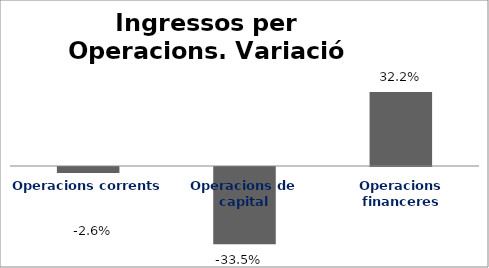
| Category | Series 0 |
|---|---|
| Operacions corrents | -0.026 |
| Operacions de capital | -0.335 |
| Operacions financeres | 0.322 |